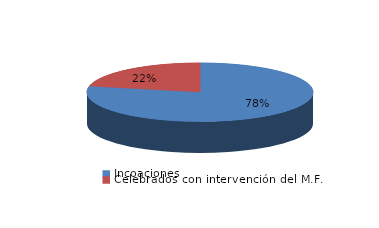
| Category | Series 0 |
|---|---|
| Incoaciones | 8527 |
| Celebrados con intervención del M.F. | 2368 |